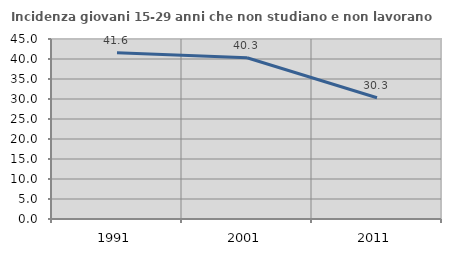
| Category | Incidenza giovani 15-29 anni che non studiano e non lavorano  |
|---|---|
| 1991.0 | 41.557 |
| 2001.0 | 40.31 |
| 2011.0 | 30.317 |